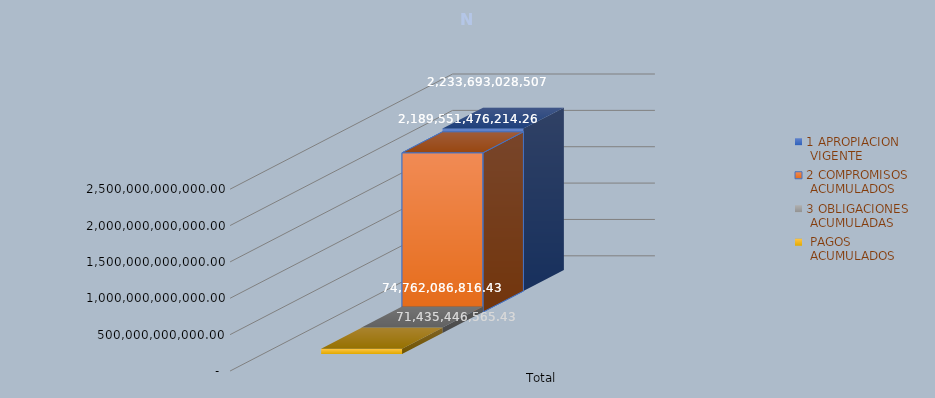
| Category | 1 APROPIACION
 VIGENTE | 2 COMPROMISOS
 ACUMULADOS | 3 OBLIGACIONES
 ACUMULADAS |  PAGOS
 ACUMULADOS |
|---|---|---|---|---|
| Total | 2233693028507 | 2189551476214.26 | 74762086816.43 | 71435446565.43 |